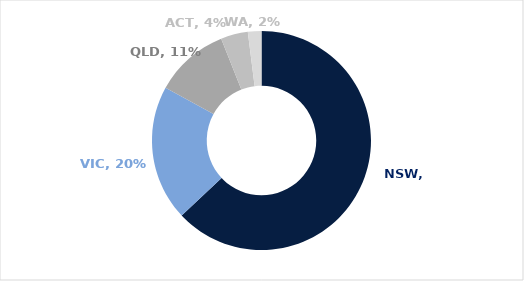
| Category | Series 0 |
|---|---|
| NSW | 0.63 |
| VIC | 0.2 |
| QLD | 0.11 |
| ACT | 0.04 |
| WA | 0.02 |